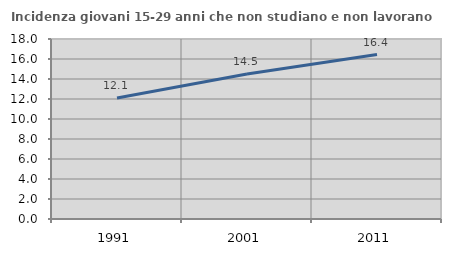
| Category | Incidenza giovani 15-29 anni che non studiano e non lavorano  |
|---|---|
| 1991.0 | 12.097 |
| 2001.0 | 14.496 |
| 2011.0 | 16.446 |